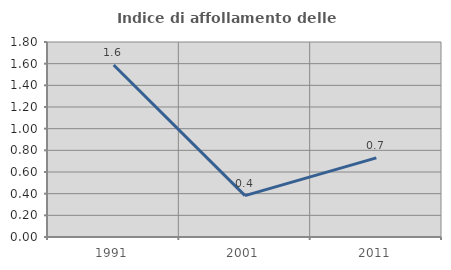
| Category | Indice di affollamento delle abitazioni  |
|---|---|
| 1991.0 | 1.587 |
| 2001.0 | 0.382 |
| 2011.0 | 0.73 |